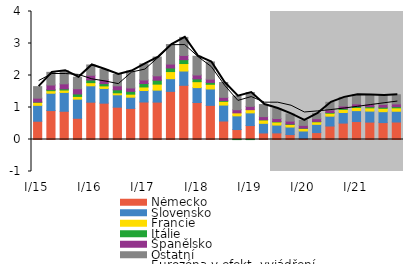
| Category | Německo | Slovensko | Francie | Itálie | Španělsko | Ostatní |
|---|---|---|---|---|---|---|
| I/15 | 0.571 | 0.497 | 0.095 | 0.009 | 0.12 | 0.36 |
| II | 0.904 | 0.542 | 0.079 | 0.032 | 0.146 | 0.396 |
| III | 0.882 | 0.589 | 0.075 | 0.038 | 0.156 | 0.411 |
| IV | 0.663 | 0.598 | 0.085 | 0.078 | 0.163 | 0.359 |
| I/16 | 1.166 | 0.512 | 0.098 | 0.084 | 0.147 | 0.321 |
| II | 1.136 | 0.46 | 0.079 | 0.072 | 0.123 | 0.316 |
| III | 1.01 | 0.386 | 0.063 | 0.094 | 0.125 | 0.354 |
| IV | 0.971 | 0.351 | 0.095 | 0.088 | 0.105 | 0.528 |
| I/17 | 1.172 | 0.36 | 0.11 | 0.108 | 0.11 | 0.503 |
| II | 1.169 | 0.374 | 0.188 | 0.122 | 0.138 | 0.586 |
| III | 1.504 | 0.395 | 0.224 | 0.111 | 0.123 | 0.609 |
| IV | 1.693 | 0.447 | 0.234 | 0.12 | 0.134 | 0.564 |
| I/18 | 1.156 | 0.466 | 0.186 | 0.087 | 0.121 | 0.586 |
| II | 1.067 | 0.512 | 0.147 | 0.058 | 0.102 | 0.538 |
| III | 0.577 | 0.498 | 0.116 | 0.025 | 0.101 | 0.463 |
| IV | 0.311 | 0.428 | 0.093 | -0.003 | 0.098 | 0.429 |
| I/19 | 0.436 | 0.397 | 0.1 | -0.003 | 0.103 | 0.434 |
| II | 0.205 | 0.3 | 0.108 | 0.006 | 0.097 | 0.377 |
| III | 0.206 | 0.245 | 0.096 | 0.014 | 0.095 | 0.313 |
| IV | 0.153 | 0.237 | 0.081 | 0.014 | 0.09 | 0.226 |
| I/20 | 0.037 | 0.229 | 0.08 | 0.01 | 0.085 | 0.156 |
| II | 0.216 | 0.258 | 0.079 | 0.013 | 0.084 | 0.167 |
| III | 0.422 | 0.308 | 0.092 | 0.021 | 0.081 | 0.238 |
| IV | 0.513 | 0.331 | 0.097 | 0.027 | 0.08 | 0.269 |
| I/21 | 0.561 | 0.341 | 0.099 | 0.033 | 0.079 | 0.286 |
| II | 0.544 | 0.344 | 0.101 | 0.035 | 0.082 | 0.285 |
| III | 0.528 | 0.341 | 0.104 | 0.036 | 0.085 | 0.282 |
| IV | 0.547 | 0.336 | 0.107 | 0.037 | 0.085 | 0.286 |